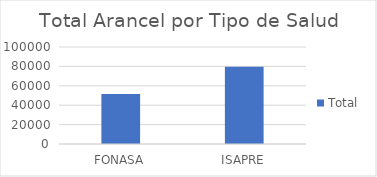
| Category | Total |
|---|---|
| FONASA | 51600 |
| ISAPRE | 79707 |